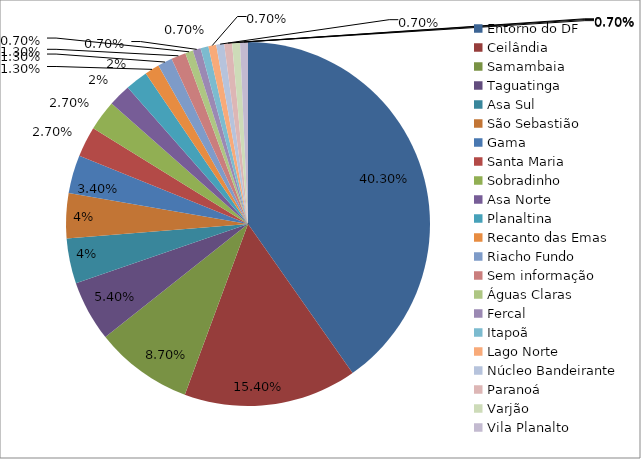
| Category | Series 0 |
|---|---|
| Entorno do DF | 0.403 |
| Ceilândia | 0.154 |
| Samambaia | 0.087 |
| Taguatinga | 0.054 |
| Asa Sul | 0.04 |
| São Sebastião | 0.04 |
| Gama | 0.034 |
| Santa Maria | 0.027 |
| Sobradinho | 0.027 |
| Asa Norte | 0.02 |
| Planaltina | 0.02 |
| Recanto das Emas | 0.013 |
| Riacho Fundo | 0.013 |
| Sem informação | 0.013 |
| Águas Claras | 0.007 |
| Fercal | 0.007 |
| Itapoã | 0.007 |
| Lago Norte | 0.007 |
| Núcleo Bandeirante | 0.007 |
| Paranoá | 0.007 |
| Varjão | 0.007 |
| Vila Planalto | 0.007 |